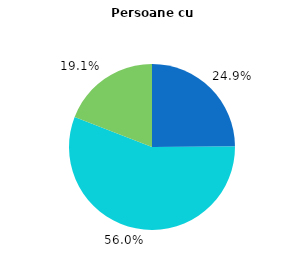
| Category | Persoane cu dizabilități |
|---|---|
| Ocupații cu calificare înată | 24.9 |
| Ocupații cu calificare medie | 56 |
| Ocupații cu calificare joasă | 19.1 |